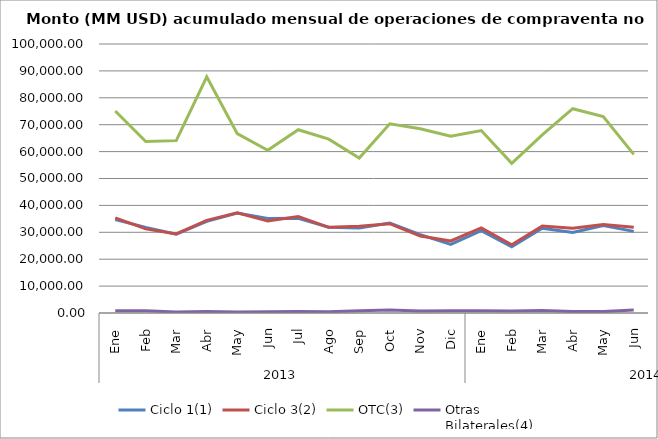
| Category | Ciclo 1(1) | Ciclo 3(2) | OTC(3) | Otras
Bilaterales(4) |
|---|---|---|---|---|
| 0 | 34736.674 | 35336.778 | 75100.994 | 862.558 |
| 1 | 31837.301 | 31276.084 | 63735.014 | 835.426 |
| 2 | 29308.645 | 29417.861 | 64070.642 | 371.583 |
| 3 | 34083.554 | 34428.23 | 87796.406 | 540.738 |
| 4 | 37163.38 | 37242.543 | 66687.424 | 368.797 |
| 5 | 35163.266 | 34165.361 | 60467.987 | 473.52 |
| 6 | 35197.057 | 35828.881 | 68121.887 | 537.978 |
| 7 | 31913.776 | 31846.832 | 64630.867 | 477.656 |
| 8 | 31601.855 | 32260.646 | 57599.123 | 864.94 |
| 9 | 33455.872 | 33201.092 | 70316.044 | 1074.052 |
| 10 | 29141.89 | 28620.849 | 68482.193 | 758.559 |
| 11 | 25532.796 | 26816.016 | 65678.317 | 842.072 |
| 12 | 30609.998 | 31608.391 | 67807.808 | 838.473 |
| 13 | 24661.445 | 25355.64 | 55646.165 | 717.558 |
| 14 | 31490.456 | 32327.003 | 66188.016 | 905.778 |
| 15 | 29968.466 | 31511.409 | 75953.393 | 552.114 |
| 16 | 32511.8 | 32893.552 | 73041.006 | 512.251 |
| 17 | 30347.815 | 31837.962 | 58974.75 | 1157.814 |